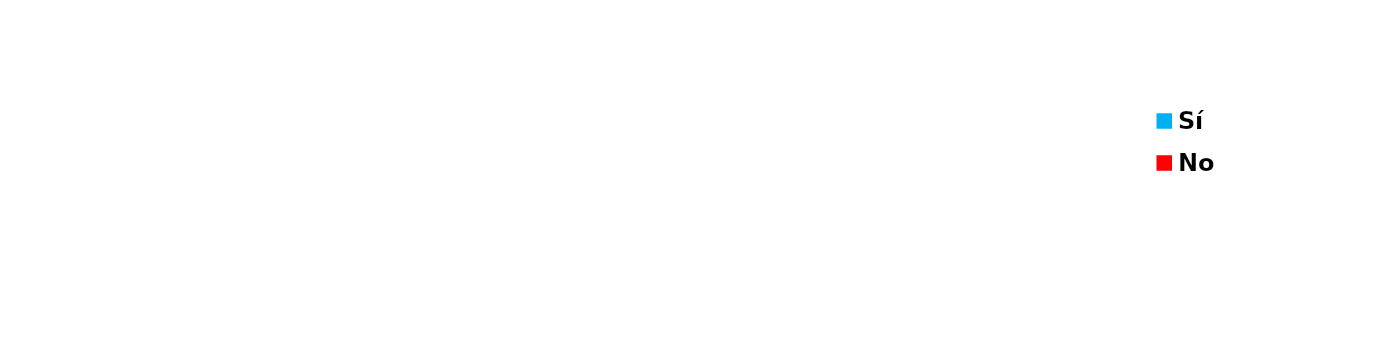
| Category | Series 0 |
|---|---|
| Sí | 0 |
| No | 0 |